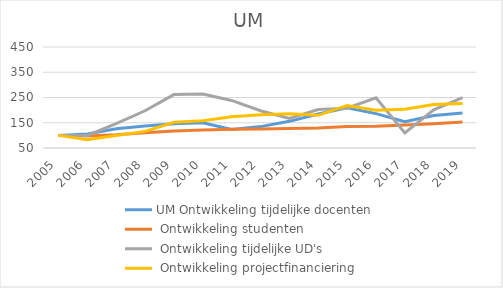
| Category | UM |
|---|---|
| 2005.0 | 100 |
| 2006.0 | 82.665 |
| 2007.0 | 99.766 |
| 2008.0 | 115.833 |
| 2009.0 | 151.837 |
| 2010.0 | 158.143 |
| 2011.0 | 173.414 |
| 2012.0 | 181.614 |
| 2013.0 | 185.353 |
| 2014.0 | 179.514 |
| 2015.0 | 218.554 |
| 2016.0 | 199.179 |
| 2017.0 | 203.379 |
| 2018.0 | 222.378 |
| 2019.0 | 226.434 |